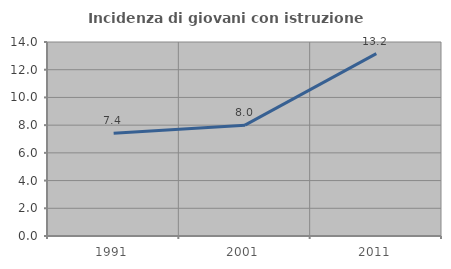
| Category | Incidenza di giovani con istruzione universitaria |
|---|---|
| 1991.0 | 7.407 |
| 2001.0 | 8 |
| 2011.0 | 13.158 |